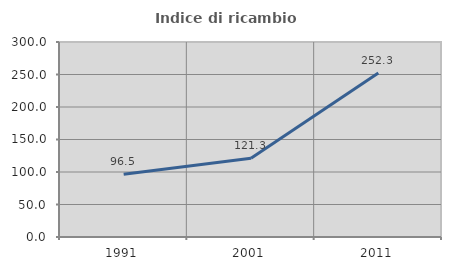
| Category | Indice di ricambio occupazionale  |
|---|---|
| 1991.0 | 96.491 |
| 2001.0 | 121.311 |
| 2011.0 | 252.273 |